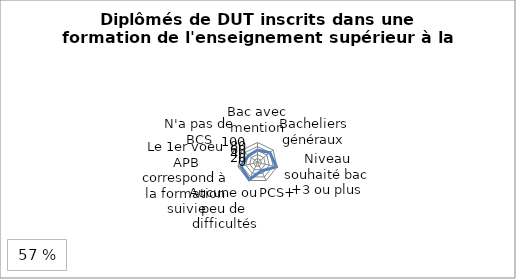
| Category | Diplômés de DUT inscrits dans une formation de l'enseignement supérieur à la rentrée 2017 |
|---|---|
| Bac avec mention | 62 |
| Bacheliers généraux | 79.1 |
| Niveau souhaité bac +3 ou plus | 96.9 |
| PCS+ | 46 |
| Aucune ou peu de difficultés | 95.1 |
| Le 1er voeu APB correspond à la formation suivie | 86.6 |
| N'a pas de BCS | 56.6 |